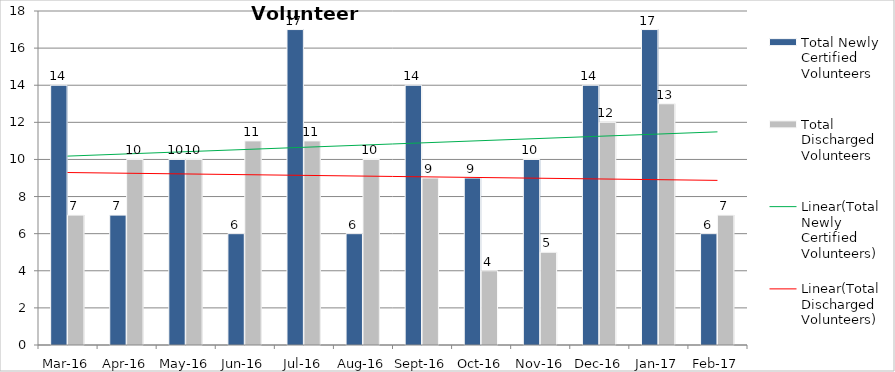
| Category | Total Newly Certified Volunteers | Total Discharged Volunteers |
|---|---|---|
| Mar-16 | 14 | 7 |
| Apr-16 | 7 | 10 |
| May-16 | 10 | 10 |
| Jun-16 | 6 | 11 |
| Jul-16 | 17 | 11 |
| Aug-16 | 6 | 10 |
| Sep-16 | 14 | 9 |
| Oct-16 | 9 | 4 |
| Nov-16 | 10 | 5 |
| Dec-16 | 14 | 12 |
| Jan-17 | 17 | 13 |
| Feb-17 | 6 | 7 |